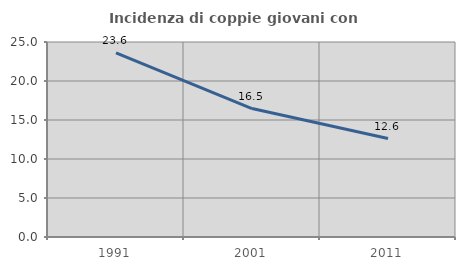
| Category | Incidenza di coppie giovani con figli |
|---|---|
| 1991.0 | 23.614 |
| 2001.0 | 16.463 |
| 2011.0 | 12.626 |